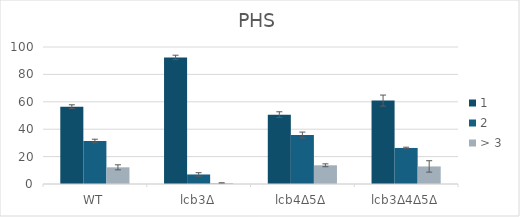
| Category | 1 | 2 | > 3 |
|---|---|---|---|
| WT | 56.44 | 31.392 | 12.168 |
| lcb3Δ | 92.411 | 6.959 | 0.631 |
| lcb4Δ5Δ | 50.629 | 35.709 | 13.662 |
| lcb3Δ4Δ5Δ | 60.862 | 26.314 | 12.823 |